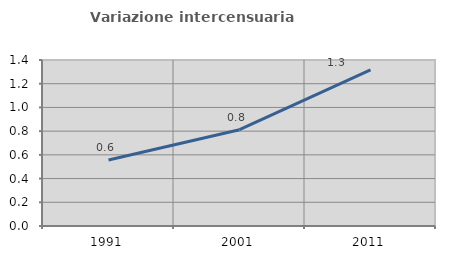
| Category | Variazione intercensuaria annua |
|---|---|
| 1991.0 | 0.556 |
| 2001.0 | 0.812 |
| 2011.0 | 1.317 |